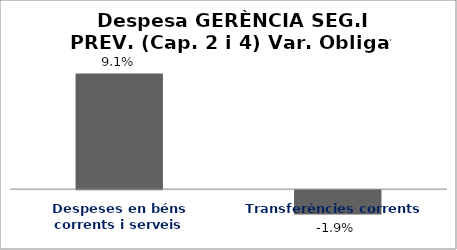
| Category | Series 0 |
|---|---|
| Despeses en béns corrents i serveis | 0.091 |
| Transferències corrents | -0.019 |